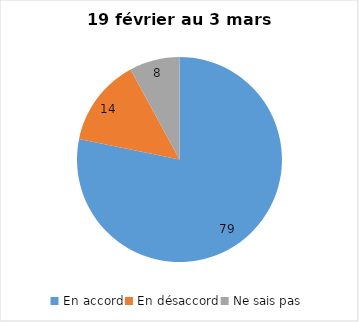
| Category | Series 0 |
|---|---|
| En accord | 79 |
| En désaccord | 14 |
| Ne sais pas | 8 |